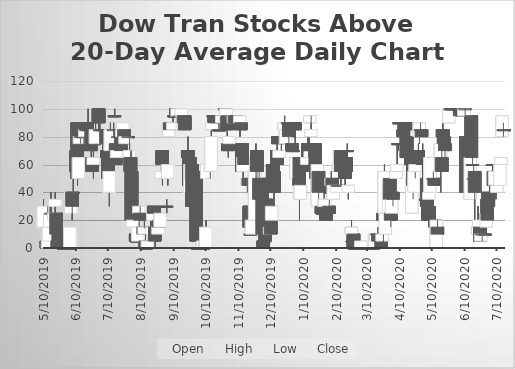
| Category | Open | High | Low | Close |
|---|---|---|---|---|
| 5/10/19 | 15 | 35 | 5 | 30 |
| 5/13/19 | 5 | 5 | 0.01 | 0.01 |
| 5/14/19 | 0.01 | 30 | 0.01 | 10 |
| 5/15/19 | 5 | 15 | 5 | 15 |
| 5/16/19 | 15 | 35 | 15 | 25 |
| 5/17/19 | 25 | 40 | 20 | 25 |
| 5/20/19 | 20 | 25 | 20 | 25 |
| 5/21/19 | 30 | 40 | 25 | 35 |
| 5/22/19 | 25 | 25 | 10 | 10 |
| 5/23/19 | 5 | 5 | 0.01 | 0.01 |
| 5/24/19 | 10 | 10 | 0.01 | 0.01 |
| 5/28/19 | 10 | 10 | 0.01 | 0.01 |
| 5/29/19 | 0.01 | 0.01 | 0.01 | 0.01 |
| 5/30/19 | 0.01 | 0.01 | 0.01 | 0.01 |
| 5/31/19 | 0.01 | 0.01 | 0.01 | 0.01 |
| 6/3/19 | 0.01 | 0.01 | 0.01 | 0.01 |
| 6/4/19 | 0.01 | 15 | 0.01 | 15 |
| 6/5/19 | 25 | 40 | 25 | 40 |
| 6/6/19 | 40 | 40 | 20 | 30 |
| 6/7/19 | 40 | 60 | 40 | 40 |
| 6/10/19 | 70 | 80 | 55 | 55 |
| 6/11/19 | 90 | 90 | 45 | 50 |
| 6/12/19 | 50 | 70 | 50 | 65 |
| 6/13/19 | 75 | 80 | 75 | 80 |
| 6/14/19 | 80 | 80 | 75 | 80 |
| 6/17/19 | 80 | 80 | 70 | 80 |
| 6/18/19 | 80 | 85 | 80 | 85 |
| 6/19/19 | 85 | 85 | 85 | 85 |
| 6/20/19 | 90 | 90 | 85 | 85 |
| 6/21/19 | 85 | 100 | 85 | 85 |
| 6/24/19 | 85 | 85 | 65 | 70 |
| 6/25/19 | 65 | 65 | 55 | 55 |
| 6/26/19 | 60 | 75 | 50 | 65 |
| 6/27/19 | 75 | 75 | 70 | 75 |
| 6/28/19 | 75 | 95 | 75 | 85 |
| 7/1/19 | 100 | 100 | 85 | 90 |
| 7/2/19 | 85 | 95 | 85 | 85 |
| 7/3/19 | 85 | 85 | 85 | 85 |
| 7/5/19 | 85 | 85 | 70 | 85 |
| 7/8/19 | 85 | 85 | 75 | 75 |
| 7/9/19 | 70 | 70 | 50 | 65 |
| 7/10/19 | 65 | 65 | 40 | 50 |
| 7/11/19 | 40 | 65 | 30 | 55 |
| 7/12/19 | 70 | 90 | 70 | 85 |
| 7/15/19 | 85 | 90 | 80 | 85 |
| 7/16/19 | 95 | 100 | 95 | 95 |
| 7/17/19 | 75 | 75 | 60 | 60 |
| 7/18/19 | 65 | 70 | 65 | 70 |
| 7/19/19 | 80 | 85 | 75 | 80 |
| 7/22/19 | 85 | 85 | 70 | 70 |
| 7/23/19 | 80 | 85 | 70 | 85 |
| 7/24/19 | 85 | 90 | 85 | 90 |
| 7/25/19 | 85 | 85 | 75 | 75 |
| 7/26/19 | 75 | 85 | 75 | 80 |
| 7/29/19 | 80 | 85 | 80 | 80 |
| 7/30/19 | 65 | 80 | 65 | 70 |
| 7/31/19 | 65 | 70 | 50 | 55 |
| 8/1/19 | 55 | 70 | 15 | 20 |
| 8/2/19 | 15 | 20 | 10 | 20 |
| 8/5/19 | 10 | 10 | 5 | 5 |
| 8/6/19 | 5 | 10 | 5 | 5 |
| 8/7/19 | 5 | 15 | 5 | 15 |
| 8/8/19 | 25 | 30 | 15 | 30 |
| 8/9/19 | 25 | 30 | 20 | 20 |
| 8/12/19 | 15 | 15 | 10 | 10 |
| 8/13/19 | 10 | 20 | 10 | 15 |
| 8/14/19 | 5 | 10 | 0.01 | 0.01 |
| 8/15/19 | 0.01 | 0.01 | 0.01 | 0.01 |
| 8/16/19 | 0.01 | 5 | 0.01 | 5 |
| 8/19/19 | 15 | 20 | 15 | 15 |
| 8/20/19 | 10 | 20 | 10 | 15 |
| 8/21/19 | 20 | 30 | 20 | 25 |
| 8/22/19 | 30 | 30 | 20 | 25 |
| 8/23/19 | 15 | 20 | 0.01 | 5 |
| 8/26/19 | 10 | 15 | 5 | 15 |
| 8/27/19 | 20 | 20 | 15 | 15 |
| 8/28/19 | 15 | 30 | 15 | 25 |
| 8/29/19 | 50 | 70 | 50 | 55 |
| 8/30/19 | 70 | 70 | 45 | 60 |
| 9/3/19 | 30 | 35 | 25 | 30 |
| 9/4/19 | 50 | 60 | 45 | 60 |
| 9/5/19 | 80 | 90 | 80 | 90 |
| 9/6/19 | 90 | 90 | 85 | 85 |
| 9/9/19 | 85 | 95 | 85 | 90 |
| 9/10/19 | 95 | 95 | 95 | 95 |
| 9/11/19 | 95 | 95 | 95 | 95 |
| 9/12/19 | 100 | 100 | 95 | 95 |
| 9/13/19 | 95 | 100 | 95 | 100 |
| 9/16/19 | 95 | 95 | 95 | 95 |
| 9/17/19 | 95 | 100 | 90 | 100 |
| 9/18/19 | 85 | 95 | 85 | 95 |
| 9/19/19 | 95 | 95 | 90 | 90 |
| 9/20/19 | 95 | 95 | 85 | 85 |
| 9/23/19 | 70 | 80 | 60 | 65 |
| 9/24/19 | 65 | 70 | 40 | 45 |
| 9/25/19 | 40 | 65 | 40 | 60 |
| 9/26/19 | 50 | 60 | 45 | 60 |
| 9/27/19 | 60 | 70 | 30 | 30 |
| 9/30/19 | 35 | 55 | 20 | 35 |
| 10/1/19 | 55 | 65 | 5 | 5 |
| 10/2/19 | 0.01 | 0.01 | 0.01 | 0.01 |
| 10/3/19 | 0.01 | 0.01 | 0.01 | 0.01 |
| 10/4/19 | 0.01 | 0.01 | 0.01 | 0.01 |
| 10/7/19 | 0.01 | 5 | 0.01 | 5 |
| 10/8/19 | 0.01 | 5 | 0.01 | 0.01 |
| 10/9/19 | 0.01 | 10 | 0.01 | 5 |
| 10/10/19 | 0.01 | 20 | 0.01 | 15 |
| 10/11/19 | 50 | 80 | 50 | 60 |
| 10/14/19 | 55 | 60 | 50 | 60 |
| 10/15/19 | 55 | 90 | 55 | 80 |
| 10/16/19 | 85 | 95 | 85 | 90 |
| 10/17/19 | 95 | 95 | 90 | 95 |
| 10/18/19 | 95 | 95 | 90 | 90 |
| 10/21/19 | 95 | 95 | 90 | 90 |
| 10/22/19 | 85 | 90 | 85 | 85 |
| 10/23/19 | 85 | 85 | 85 | 85 |
| 10/24/19 | 95 | 95 | 85 | 90 |
| 10/25/19 | 90 | 95 | 90 | 95 |
| 10/28/19 | 100 | 100 | 95 | 100 |
| 10/29/19 | 90 | 100 | 90 | 100 |
| 10/30/19 | 95 | 95 | 75 | 85 |
| 10/31/19 | 75 | 80 | 65 | 70 |
| 11/1/19 | 75 | 80 | 70 | 80 |
| 11/4/19 | 90 | 90 | 85 | 90 |
| 11/5/19 | 90 | 95 | 90 | 95 |
| 11/6/19 | 95 | 95 | 90 | 90 |
| 11/7/19 | 95 | 95 | 90 | 95 |
| 11/8/19 | 95 | 95 | 90 | 90 |
| 11/11/19 | 90 | 95 | 80 | 95 |
| 11/12/19 | 90 | 90 | 85 | 85 |
| 11/13/19 | 75 | 75 | 55 | 55 |
| 11/14/19 | 55 | 65 | 50 | 65 |
| 11/15/19 | 65 | 65 | 60 | 60 |
| 11/18/19 | 45 | 50 | 40 | 50 |
| 11/19/19 | 50 | 55 | 45 | 45 |
| 11/20/19 | 30 | 35 | 15 | 15 |
| 11/21/19 | 10 | 20 | 10 | 10 |
| 11/22/19 | 10 | 25 | 10 | 20 |
| 11/25/19 | 20 | 60 | 20 | 55 |
| 11/26/19 | 55 | 75 | 50 | 65 |
| 11/27/19 | 70 | 70 | 50 | 55 |
| 11/29/19 | 50 | 65 | 30 | 35 |
| 12/2/19 | 50 | 50 | 10 | 10 |
| 12/3/19 | 5 | 5 | 0.01 | 0.01 |
| 12/4/19 | 5 | 15 | 5 | 5 |
| 12/5/19 | 10 | 10 | 0.01 | 5 |
| 12/6/19 | 35 | 35 | 20 | 20 |
| 12/9/19 | 10 | 30 | 10 | 15 |
| 12/10/19 | 20 | 25 | 5 | 10 |
| 12/11/19 | 20 | 30 | 15 | 30 |
| 12/12/19 | 60 | 65 | 45 | 50 |
| 12/13/19 | 55 | 70 | 30 | 40 |
| 12/16/19 | 70 | 80 | 60 | 60 |
| 12/17/19 | 80 | 80 | 75 | 75 |
| 12/18/19 | 65 | 70 | 50 | 70 |
| 12/19/19 | 80 | 85 | 75 | 80 |
| 12/20/19 | 80 | 90 | 70 | 80 |
| 12/23/19 | 85 | 95 | 80 | 90 |
| 12/24/19 | 75 | 85 | 75 | 85 |
| 12/26/19 | 90 | 90 | 85 | 90 |
| 12/27/19 | 90 | 90 | 75 | 80 |
| 12/30/19 | 75 | 75 | 70 | 70 |
| 12/31/19 | 70 | 70 | 70 | 70 |
| 1/2/20 | 90 | 90 | 75 | 85 |
| 1/3/20 | 50 | 65 | 45 | 65 |
| 1/6/20 | 65 | 65 | 20 | 45 |
| 1/7/20 | 35 | 60 | 35 | 45 |
| 1/8/20 | 60 | 70 | 55 | 60 |
| 1/9/20 | 60 | 75 | 55 | 55 |
| 1/10/20 | 60 | 60 | 55 | 55 |
| 1/13/20 | 60 | 65 | 60 | 65 |
| 1/14/20 | 75 | 80 | 70 | 70 |
| 1/15/20 | 75 | 80 | 75 | 75 |
| 1/16/20 | 90 | 95 | 90 | 95 |
| 1/17/20 | 80 | 95 | 80 | 85 |
| 1/21/20 | 75 | 75 | 40 | 55 |
| 1/22/20 | 60 | 60 | 50 | 50 |
| 1/23/20 | 30 | 60 | 25 | 60 |
| 1/24/20 | 55 | 55 | 30 | 40 |
| 1/27/20 | 30 | 30 | 25 | 25 |
| 1/28/20 | 25 | 30 | 25 | 25 |
| 1/29/20 | 30 | 40 | 30 | 35 |
| 1/30/20 | 30 | 35 | 25 | 35 |
| 1/31/20 | 25 | 30 | 20 | 20 |
| 2/3/20 | 30 | 35 | 20 | 25 |
| 2/4/20 | 40 | 45 | 35 | 40 |
| 2/5/20 | 45 | 55 | 45 | 50 |
| 2/6/20 | 50 | 50 | 40 | 40 |
| 2/7/20 | 35 | 50 | 35 | 45 |
| 2/10/20 | 40 | 45 | 40 | 45 |
| 2/11/20 | 45 | 50 | 45 | 45 |
| 2/12/20 | 55 | 65 | 55 | 60 |
| 2/13/20 | 65 | 70 | 55 | 70 |
| 2/14/20 | 70 | 70 | 45 | 55 |
| 2/18/20 | 60 | 60 | 45 | 50 |
| 2/19/20 | 65 | 65 | 55 | 55 |
| 2/20/20 | 70 | 75 | 55 | 70 |
| 2/21/20 | 40 | 45 | 35 | 45 |
| 2/24/20 | 10 | 20 | 5 | 15 |
| 2/25/20 | 5 | 5 | 5 | 5 |
| 2/26/20 | 10 | 10 | 0.01 | 0.01 |
| 2/27/20 | 0.01 | 0.01 | 0.01 | 0.01 |
| 2/28/20 | 0.01 | 0.01 | 0.01 | 0.01 |
| 3/2/20 | 0.01 | 0.01 | 0.01 | 0.01 |
| 3/3/20 | 0.01 | 0.01 | 0.01 | 0.01 |
| 3/4/20 | 0.01 | 5 | 0.01 | 5 |
| 3/5/20 | 0.01 | 0.01 | 0.01 | 0.01 |
| 3/6/20 | 0.01 | 0.01 | 0.01 | 0.01 |
| 3/9/20 | 0.01 | 0.01 | 0.01 | 0.01 |
| 3/10/20 | 0.01 | 0.01 | 0.01 | 0.01 |
| 3/11/20 | 0.01 | 0.01 | 0.01 | 0.01 |
| 3/12/20 | 0.01 | 0.01 | 0.01 | 0.01 |
| 3/13/20 | 0.01 | 0.01 | 0.01 | 0.01 |
| 3/16/20 | 0.01 | 0.01 | 0.01 | 0.01 |
| 3/17/20 | 0.01 | 10 | 0.01 | 10 |
| 3/18/20 | 5 | 10 | 0.01 | 10 |
| 3/19/20 | 10 | 10 | 10 | 10 |
| 3/20/20 | 10 | 15 | 0.01 | 5 |
| 3/23/20 | 5 | 5 | 0.01 | 0.01 |
| 3/24/20 | 5 | 15 | 0.01 | 10 |
| 3/25/20 | 25 | 50 | 0.01 | 20 |
| 3/26/20 | 25 | 60 | 25 | 55 |
| 3/27/20 | 10 | 35 | 10 | 25 |
| 3/30/20 | 25 | 45 | 20 | 45 |
| 3/31/20 | 50 | 50 | 25 | 35 |
| 4/1/20 | 25 | 30 | 15 | 20 |
| 4/2/20 | 25 | 35 | 20 | 35 |
| 4/3/20 | 40 | 45 | 30 | 35 |
| 4/6/20 | 50 | 55 | 50 | 55 |
| 4/7/20 | 55 | 75 | 55 | 60 |
| 4/8/20 | 75 | 75 | 70 | 75 |
| 4/9/20 | 90 | 90 | 85 | 90 |
| 4/13/20 | 85 | 85 | 80 | 80 |
| 4/14/20 | 90 | 90 | 85 | 85 |
| 4/15/20 | 90 | 90 | 80 | 85 |
| 4/16/20 | 80 | 80 | 50 | 65 |
| 4/17/20 | 80 | 80 | 75 | 80 |
| 4/20/20 | 65 | 65 | 55 | 60 |
| 4/21/20 | 25 | 55 | 25 | 50 |
| 4/22/20 | 60 | 60 | 35 | 45 |
| 4/23/20 | 40 | 65 | 40 | 55 |
| 4/24/20 | 55 | 70 | 50 | 60 |
| 4/27/20 | 70 | 75 | 65 | 65 |
| 4/28/20 | 80 | 90 | 75 | 90 |
| 4/29/20 | 85 | 90 | 85 | 85 |
| 4/30/20 | 85 | 85 | 80 | 80 |
| 5/1/20 | 65 | 75 | 50 | 60 |
| 5/4/20 | 35 | 40 | 25 | 35 |
| 5/5/20 | 50 | 50 | 30 | 30 |
| 5/6/20 | 30 | 30 | 20 | 20 |
| 5/7/20 | 35 | 45 | 35 | 40 |
| 5/8/20 | 40 | 65 | 40 | 65 |
| 5/11/20 | 50 | 55 | 45 | 50 |
| 5/12/20 | 50 | 50 | 45 | 45 |
| 5/13/20 | 20 | 30 | 10 | 15 |
| 5/14/20 | 0.01 | 20 | 0.01 | 20 |
| 5/15/20 | 15 | 20 | 10 | 10 |
| 5/18/20 | 55 | 75 | 40 | 75 |
| 5/19/20 | 65 | 80 | 55 | 55 |
| 5/20/20 | 85 | 90 | 70 | 80 |
| 5/21/20 | 80 | 80 | 70 | 75 |
| 5/22/20 | 75 | 75 | 65 | 70 |
| 5/26/20 | 90 | 100 | 90 | 100 |
| 5/27/20 | 100 | 100 | 100 | 100 |
| 5/28/20 | 100 | 100 | 100 | 100 |
| 5/29/20 | 100 | 100 | 100 | 100 |
| 6/1/20 | 100 | 100 | 100 | 100 |
| 6/2/20 | 100 | 100 | 100 | 100 |
| 6/3/20 | 100 | 100 | 100 | 100 |
| 6/4/20 | 100 | 100 | 100 | 100 |
| 6/5/20 | 100 | 100 | 95 | 95 |
| 6/8/20 | 100 | 100 | 95 | 100 |
| 6/9/20 | 95 | 100 | 95 | 100 |
| 6/10/20 | 100 | 100 | 95 | 100 |
| 6/11/20 | 80 | 90 | 40 | 40 |
| 6/12/20 | 70 | 70 | 45 | 65 |
| 6/15/20 | 35 | 65 | 35 | 65 |
| 6/16/20 | 95 | 95 | 65 | 65 |
| 6/17/20 | 60 | 75 | 60 | 60 |
| 6/18/20 | 50 | 60 | 50 | 50 |
| 6/19/20 | 55 | 55 | 20 | 40 |
| 6/22/20 | 10 | 30 | 5 | 15 |
| 6/23/20 | 15 | 25 | 15 | 20 |
| 6/24/20 | 15 | 15 | 5 | 5 |
| 6/25/20 | 5 | 10 | 5 | 10 |
| 6/26/20 | 10 | 10 | 5 | 10 |
| 6/29/20 | 10 | 10 | 10 | 10 |
| 6/30/20 | 15 | 25 | 10 | 25 |
| 7/1/20 | 35 | 35 | 20 | 20 |
| 7/2/20 | 40 | 40 | 25 | 30 |
| 7/6/20 | 60 | 60 | 55 | 60 |
| 7/7/20 | 55 | 60 | 45 | 45 |
| 7/8/20 | 45 | 55 | 45 | 55 |
| 7/9/20 | 45 | 45 | 35 | 40 |
| 7/10/20 | 40 | 45 | 40 | 45 |
| 7/13/20 | 45 | 65 | 45 | 60 |
| 7/14/20 | 60 | 65 | 60 | 65 |
| 7/15/20 | 80 | 95 | 80 | 95 |
| 7/16/20 | 85 | 90 | 80 | 85 |
| 7/17/20 | 85 | 85 | 85 | 85 |